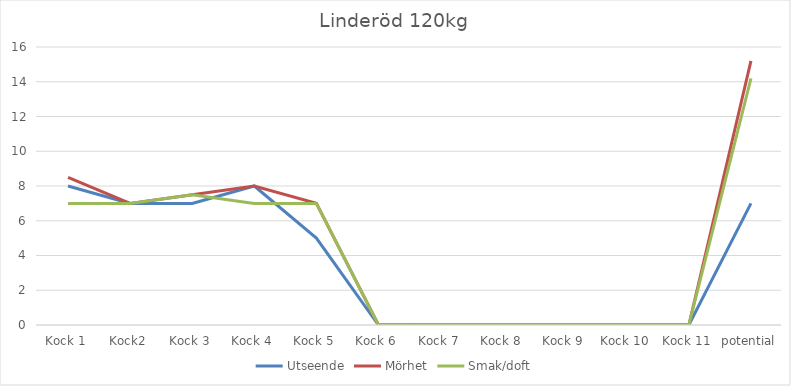
| Category | Utseende | Mörhet | Smak/doft |
|---|---|---|---|
| Kock 1 | 8 | 8.5 | 7 |
| Kock2 | 7 | 7 | 7 |
| Kock 3 | 7 | 7.5 | 7.5 |
| Kock 4 | 8 | 8 | 7 |
| Kock 5 | 5 | 7 | 7 |
| Kock 6 | 0 | 0 | 0 |
| Kock 7 | 0 | 0 | 0 |
| Kock 8 | 0 | 0 | 0 |
| Kock 9 | 0 | 0 | 0 |
| Kock 10 | 0 | 0 | 0 |
| Kock 11 | 0 | 0 | 0 |
| potential | 7 | 15.2 | 14.2 |